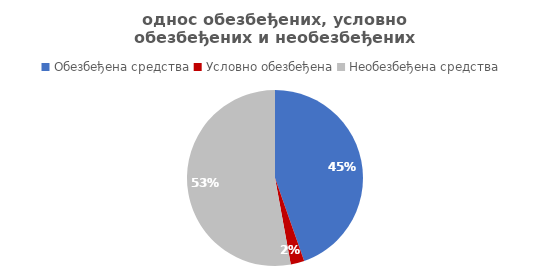
| Category | Series 0 |
|---|---|
| Обезбеђена средства | 890656.796 |
| Условно обезбеђена | 50083.346 |
| Необезбеђена средства | 1055330.577 |